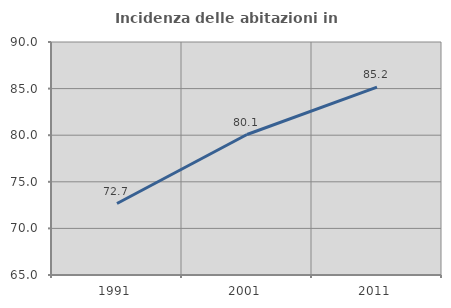
| Category | Incidenza delle abitazioni in proprietà  |
|---|---|
| 1991.0 | 72.668 |
| 2001.0 | 80.074 |
| 2011.0 | 85.152 |